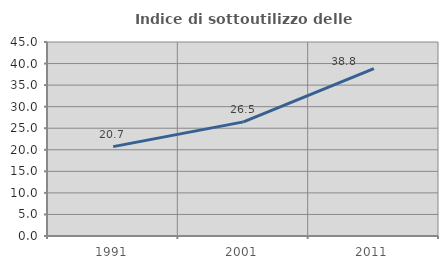
| Category | Indice di sottoutilizzo delle abitazioni  |
|---|---|
| 1991.0 | 20.725 |
| 2001.0 | 26.471 |
| 2011.0 | 38.8 |